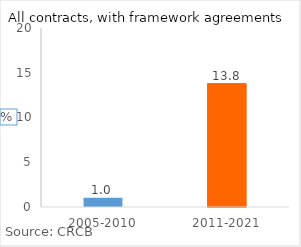
| Category | mgts_plus, without framework agreements, % |
|---|---|
| 2005-2010 | 1.022 |
| 2011-2021 | 13.792 |